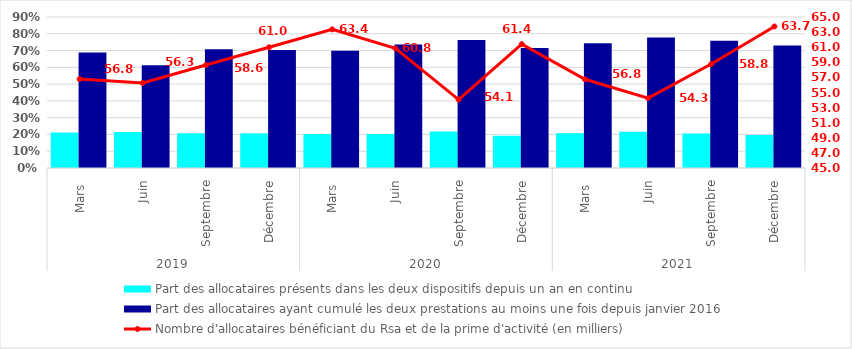
| Category | Part des allocataires présents dans les deux dispositifs depuis un an en continu | Part des allocataires ayant cumulé les deux prestations au moins une fois depuis janvier 2016 |
|---|---|---|
| 0 | 0.212 | 0.689 |
| 1 | 0.215 | 0.613 |
| 2 | 0.207 | 0.708 |
| 3 | 0.207 | 0.703 |
| 4 | 0.203 | 0.699 |
| 5 | 0.203 | 0.736 |
| 6 | 0.217 | 0.762 |
| 7 | 0.192 | 0.715 |
| 8 | 0.208 | 0.743 |
| 9 | 0.217 | 0.778 |
| 10 | 0.206 | 0.758 |
| 11 | 0.196 | 0.731 |